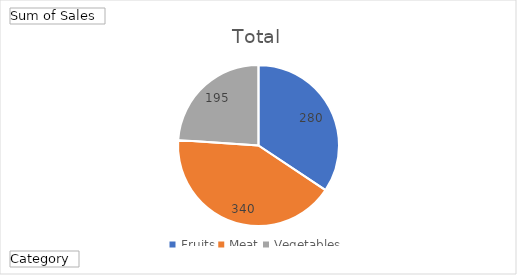
| Category | Total |
|---|---|
| Fruits | 280 |
| Meat | 340 |
| Vegetables | 195 |